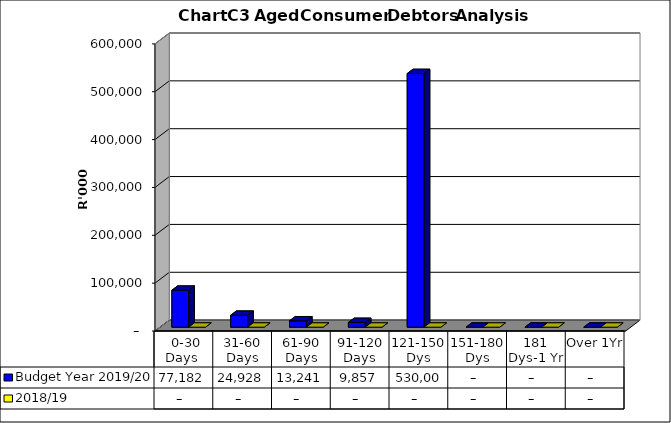
| Category | Budget Year 2019/20 | 2018/19 |
|---|---|---|
|  0-30 Days  | 77181675.66 | 0 |
| 31-60 Days | 24928144.47 | 0 |
| 61-90 Days | 13240664.89 | 0 |
| 91-120 Days | 9856778.36 | 0 |
| 121-150 Dys | 530007101.89 | 0 |
| 151-180 Dys | 0 | 0 |
| 181 Dys-1 Yr | 0 | 0 |
| Over 1Yr | 0 | 0 |